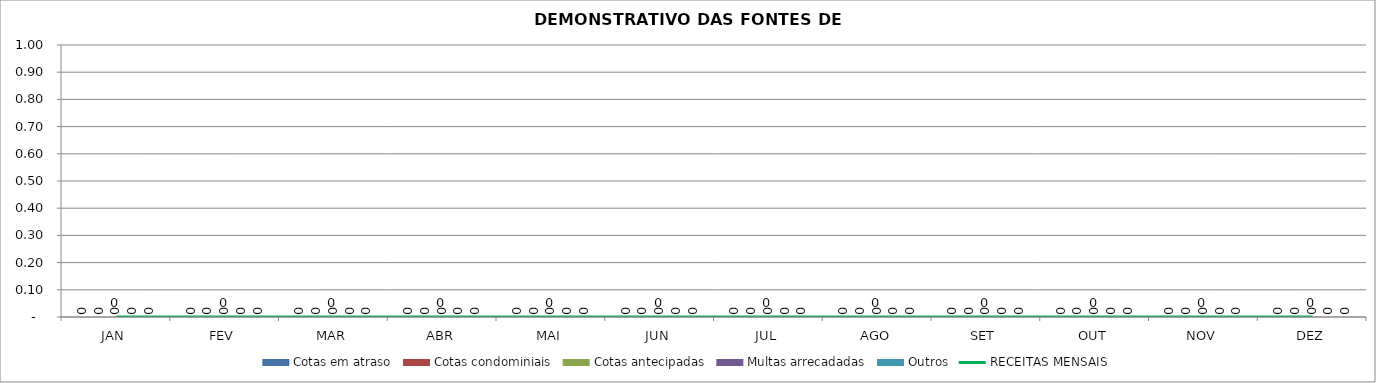
| Category | Cotas em atraso | Cotas condominiais | Cotas antecipadas | Multas arrecadadas | Outros |
|---|---|---|---|---|---|
| JAN | 0 | 0 | 0 | 0 | 0 |
| FEV | 0 | 0 | 0 | 0 | 0 |
| MAR | 0 | 0 | 0 | 0 | 0 |
| ABR | 0 | 0 | 0 | 0 | 0 |
| MAI | 0 | 0 | 0 | 0 | 0 |
| JUN | 0 | 0 | 0 | 0 | 0 |
| JUL | 0 | 0 | 0 | 0 | 0 |
| AGO | 0 | 0 | 0 | 0 | 0 |
| SET | 0 | 0 | 0 | 0 | 0 |
| OUT | 0 | 0 | 0 | 0 | 0 |
| NOV | 0 | 0 | 0 | 0 | 0 |
| DEZ | 0 | 0 | 0 | 0 | 0 |